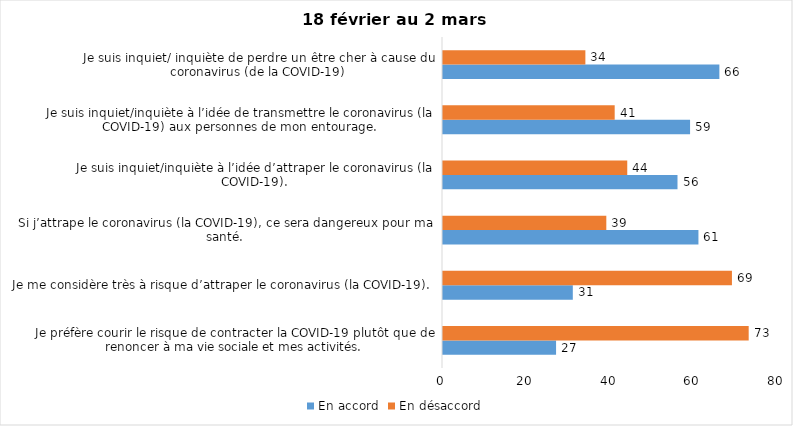
| Category | En accord | En désaccord |
|---|---|---|
| Je préfère courir le risque de contracter la COVID-19 plutôt que de renoncer à ma vie sociale et mes activités. | 27 | 73 |
| Je me considère très à risque d’attraper le coronavirus (la COVID-19). | 31 | 69 |
| Si j’attrape le coronavirus (la COVID-19), ce sera dangereux pour ma santé. | 61 | 39 |
| Je suis inquiet/inquiète à l’idée d’attraper le coronavirus (la COVID-19). | 56 | 44 |
| Je suis inquiet/inquiète à l’idée de transmettre le coronavirus (la COVID-19) aux personnes de mon entourage. | 59 | 41 |
| Je suis inquiet/ inquiète de perdre un être cher à cause du coronavirus (de la COVID-19) | 66 | 34 |